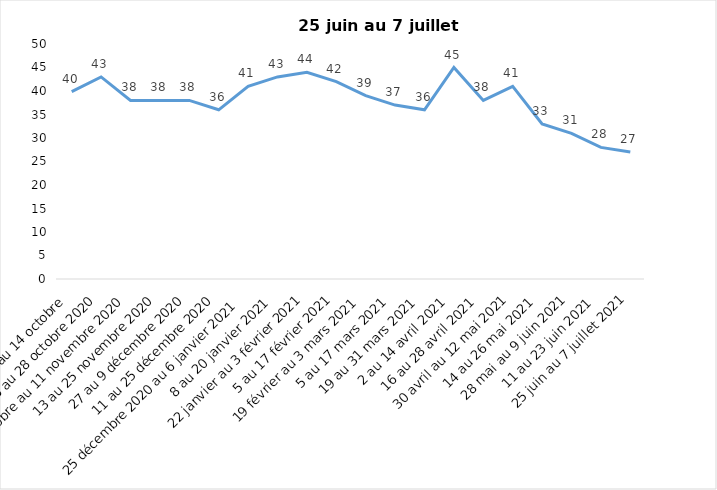
| Category | Toujours aux trois mesures |
|---|---|
| 2 au 14 octobre  | 39.85 |
| 16 au 28 octobre 2020 | 43 |
| 30 octobre au 11 novembre 2020 | 38 |
| 13 au 25 novembre 2020 | 38 |
| 27 au 9 décembre 2020 | 38 |
| 11 au 25 décembre 2020 | 36 |
| 25 décembre 2020 au 6 janvier 2021 | 41 |
| 8 au 20 janvier 2021 | 43 |
| 22 janvier au 3 février 2021 | 44 |
| 5 au 17 février 2021 | 42 |
| 19 février au 3 mars 2021 | 39 |
| 5 au 17 mars 2021 | 37 |
| 19 au 31 mars 2021 | 36 |
| 2 au 14 avril 2021 | 45 |
| 16 au 28 avril 2021 | 38 |
| 30 avril au 12 mai 2021 | 41 |
| 14 au 26 mai 2021 | 33 |
| 28 mai au 9 juin 2021 | 31 |
| 11 au 23 juin 2021 | 28 |
| 25 juin au 7 juillet 2021 | 27 |